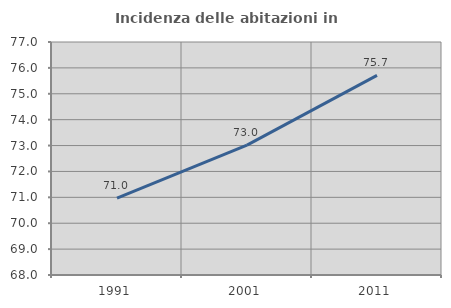
| Category | Incidenza delle abitazioni in proprietà  |
|---|---|
| 1991.0 | 70.971 |
| 2001.0 | 73.014 |
| 2011.0 | 75.708 |